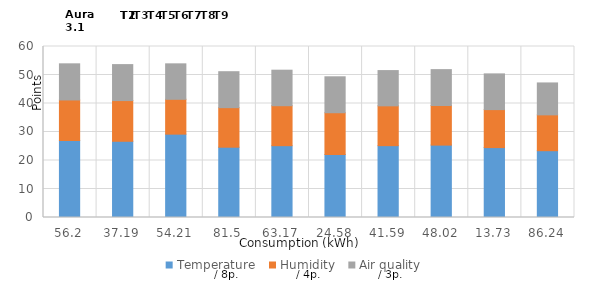
| Category | Temperature | Humidity | Air quality |
|---|---|---|---|
| 56.199999999999996 | 26.986 | 14.255 | 12.68 |
| 37.19 | 26.745 | 14.279 | 12.626 |
| 54.21 | 29.25 | 12.224 | 12.443 |
| 81.5 | 24.665 | 13.876 | 12.616 |
| 63.169999999999995 | 25.202 | 14.023 | 12.46 |
| 24.58 | 22.148 | 14.614 | 12.61 |
| 41.59 | 25.21 | 13.971 | 12.371 |
| 48.02 | 25.402 | 13.904 | 12.579 |
| 13.73 | 24.53 | 13.328 | 12.535 |
| 86.24 | 23.441 | 12.572 | 11.203 |